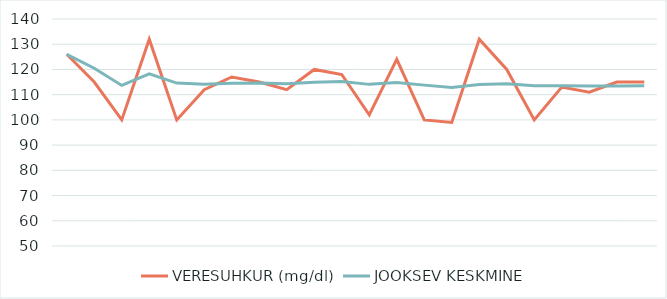
| Category | VERESUHKUR (mg/dl) | JOOKSEV KESKMINE |
|---|---|---|
| 0 | 126 | 126 |
| 1 | 115 | 120.5 |
| 2 | 100 | 113.667 |
| 3 | 132 | 118.25 |
| 4 | 100 | 114.6 |
| 5 | 112 | 114.167 |
| 6 | 117 | 114.571 |
| 7 | 115 | 114.625 |
| 8 | 112 | 114.333 |
| 9 | 120 | 114.9 |
| 10 | 118 | 115.182 |
| 11 | 102 | 114.083 |
| 12 | 124 | 114.846 |
| 13 | 100 | 113.786 |
| 14 | 99 | 112.8 |
| 15 | 132 | 114 |
| 16 | 120 | 114.353 |
| 17 | 100 | 113.556 |
| 18 | 113 | 113.526 |
| 19 | 111 | 113.4 |
| 20 | 115 | 113.476 |
| 21 | 115 | 113.545 |